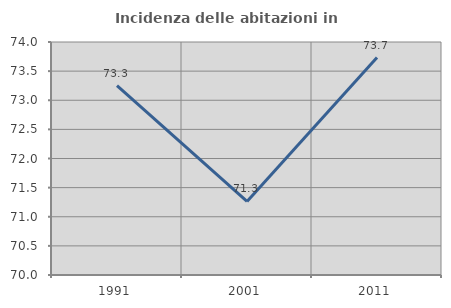
| Category | Incidenza delle abitazioni in proprietà  |
|---|---|
| 1991.0 | 73.251 |
| 2001.0 | 71.262 |
| 2011.0 | 73.732 |